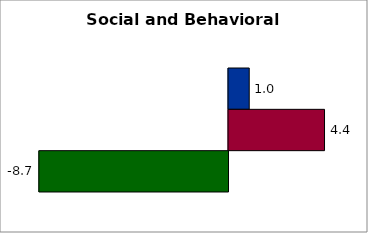
| Category | 50 states and D.C. | SREB states | State |
|---|---|---|---|
| 0 | 0.953 | 4.415 | -8.696 |